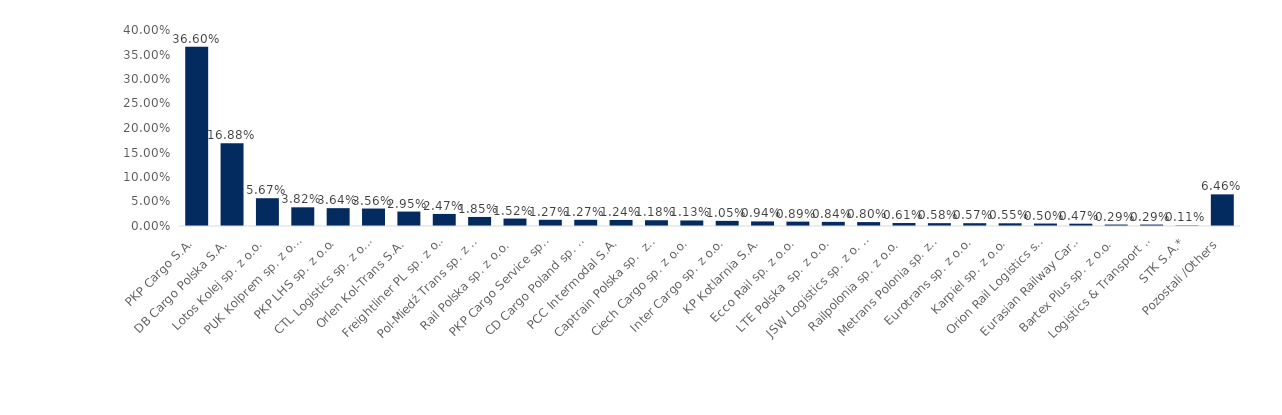
| Category | Series 0 |
|---|---|
| PKP Cargo S.A. | 0.366 |
| DB Cargo Polska S.A. | 0.169 |
| Lotos Kolej sp. z o.o. | 0.057 |
| PUK Kolprem sp. z o.o. | 0.038 |
| PKP LHS sp. z o.o. | 0.036 |
| CTL Logistics sp. z o.o. | 0.036 |
| Orlen Kol-Trans S.A. | 0.029 |
| Freightliner PL sp. z o.o. | 0.025 |
| Pol-Miedź Trans sp. z o.o. | 0.018 |
| Rail Polska sp. z o.o. | 0.015 |
| PKP Cargo Service sp. z o.o. | 0.013 |
| CD Cargo Poland sp. z o.o. | 0.013 |
| PCC Intermodal S.A. | 0.012 |
| Captrain Polska sp.  z o.o. | 0.012 |
| Ciech Cargo sp. z o.o. | 0.011 |
| Inter Cargo sp. z o.o. | 0.01 |
| KP Kotlarnia S.A. | 0.009 |
| Ecco Rail sp. z o.o. | 0.009 |
| LTE Polska  sp. z o.o. | 0.008 |
| JSW Logistics sp. z o. o. | 0.008 |
| Railpolonia sp. z o.o. | 0.006 |
| Metrans Polonia sp. z o.o. | 0.006 |
| Eurotrans sp. z o.o. | 0.006 |
| Karpiel sp. z o.o. | 0.006 |
| Orion Rail Logistics sp. z o.o. | 0.005 |
| Eurasian Railway Carrier sp. z o.o. | 0.005 |
| Bartex Plus sp. z o.o. | 0.003 |
| Logistics & Transport Company sp. z o.o. | 0.003 |
| STK S.A.* | 0.001 |
| Pozostali /Others | 0.065 |